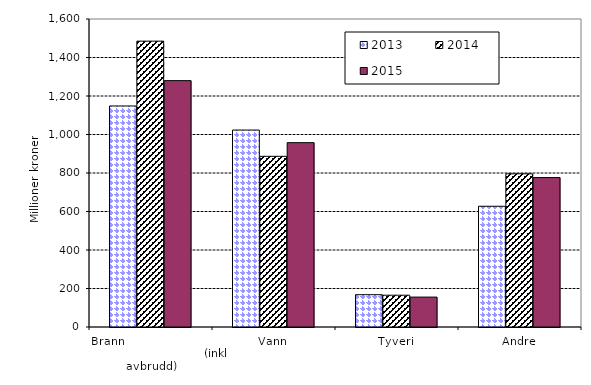
| Category | 2013 | 2014 | 2015 |
|---|---|---|---|
| Brann                                                       (inkl avbrudd) | 1148.184 | 1484.915 | 1279.836 |
| Vann | 1023.081 | 886.676 | 957.605 |
| Tyveri | 167.848 | 165.163 | 155.37 |
| Andre | 627.194 | 795.825 | 776.252 |